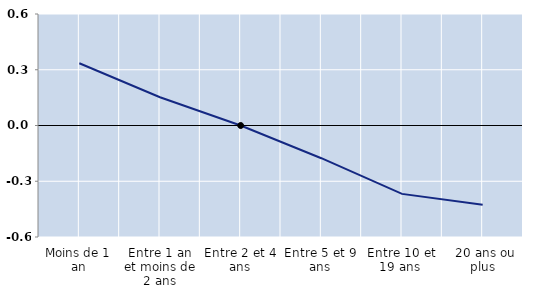
| Category | Series 0 |
|---|---|
| Moins de 1 an | 0.335 |
| Entre 1 an et moins de 2 ans | 0.152 |
| Entre 2 et 4 ans | 0 |
| Entre 5 et 9 ans | -0.176 |
| Entre 10 et 19 ans  | -0.368 |
|  20 ans ou plus | -0.426 |